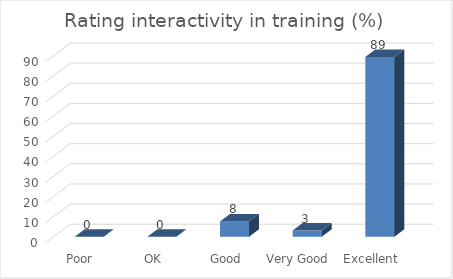
| Category | Rating interactivity in training (%) |
|---|---|
| Poor | 0 |
| OK | 0 |
| Good | 7.62 |
| Very Good | 3.07 |
| Excellent | 89.23 |